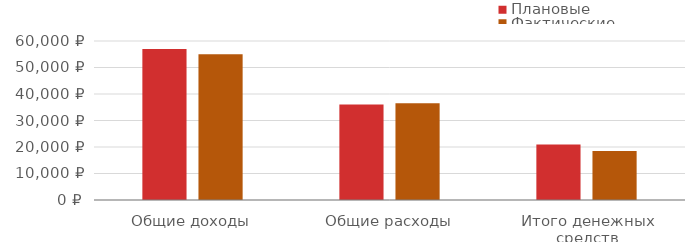
| Category | Плановые | Фактические |
|---|---|---|
| Общие доходы | 57000 | 55000 |
| Общие расходы | 36030 | 36550 |
| Итого денежных средств | 20970 | 18450 |